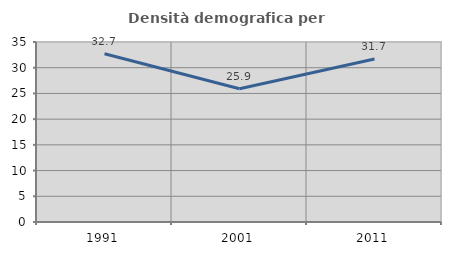
| Category | Densità demografica |
|---|---|
| 1991.0 | 32.728 |
| 2001.0 | 25.905 |
| 2011.0 | 31.688 |